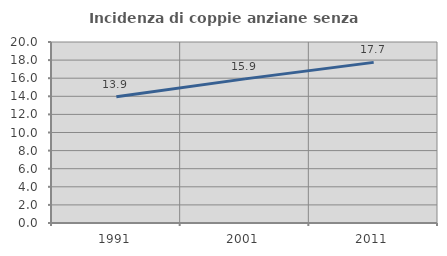
| Category | Incidenza di coppie anziane senza figli  |
|---|---|
| 1991.0 | 13.948 |
| 2001.0 | 15.924 |
| 2011.0 | 17.749 |